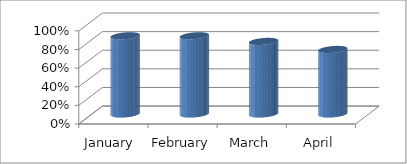
| Category | ACCURACY |
|---|---|
| January  | 0.84 |
| February | 0.84 |
| March | 0.78 |
| April | 0.694 |